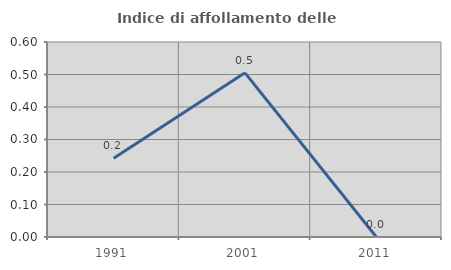
| Category | Indice di affollamento delle abitazioni  |
|---|---|
| 1991.0 | 0.242 |
| 2001.0 | 0.505 |
| 2011.0 | 0 |